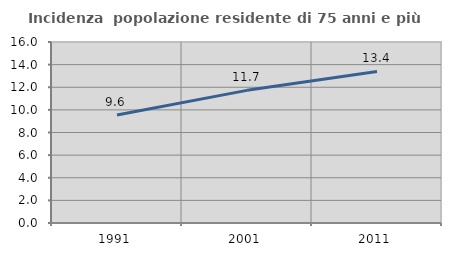
| Category | Incidenza  popolazione residente di 75 anni e più |
|---|---|
| 1991.0 | 9.554 |
| 2001.0 | 11.725 |
| 2011.0 | 13.397 |